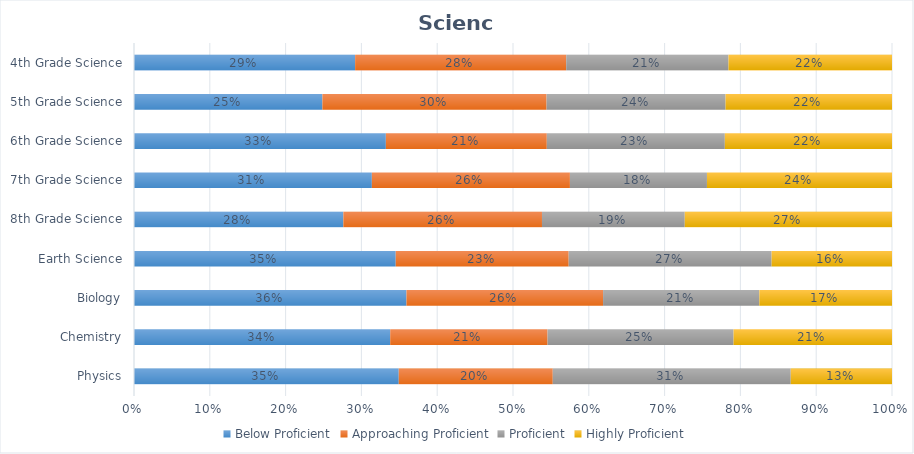
| Category | Below Proficient | Approaching Proficient | Proficient | Highly Proficient |
|---|---|---|---|---|
| Physics | 0.349 | 0.203 | 0.314 | 0.134 |
| Chemistry | 0.338 | 0.208 | 0.245 | 0.209 |
| Biology | 0.359 | 0.259 | 0.206 | 0.175 |
| Earth Science | 0.345 | 0.228 | 0.268 | 0.159 |
| 8th Grade Science | 0.276 | 0.262 | 0.188 | 0.273 |
| 7th Grade Science | 0.314 | 0.261 | 0.181 | 0.244 |
| 6th Grade Science | 0.332 | 0.212 | 0.235 | 0.221 |
| 5th Grade Science | 0.249 | 0.296 | 0.236 | 0.22 |
| 4th Grade Science | 0.292 | 0.278 | 0.214 | 0.216 |